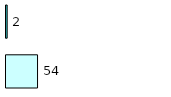
| Category | Series 0 | Series 1 |
|---|---|---|
| 0 | 54 | 2 |